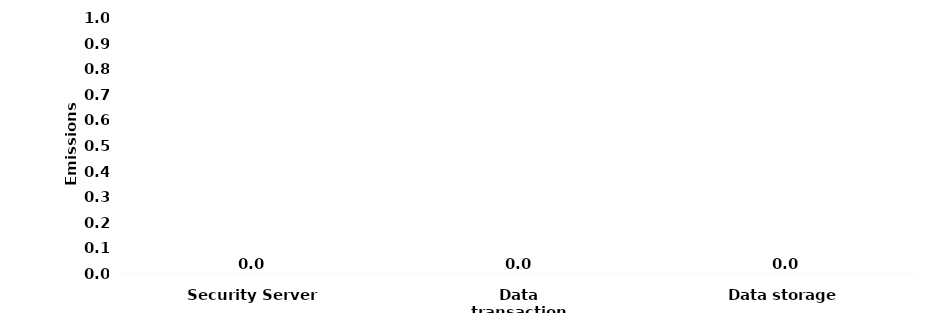
| Category | Series 0 |
|---|---|
| Security Server | 0 |
| Data transaction | 0 |
| Data storage | 0 |